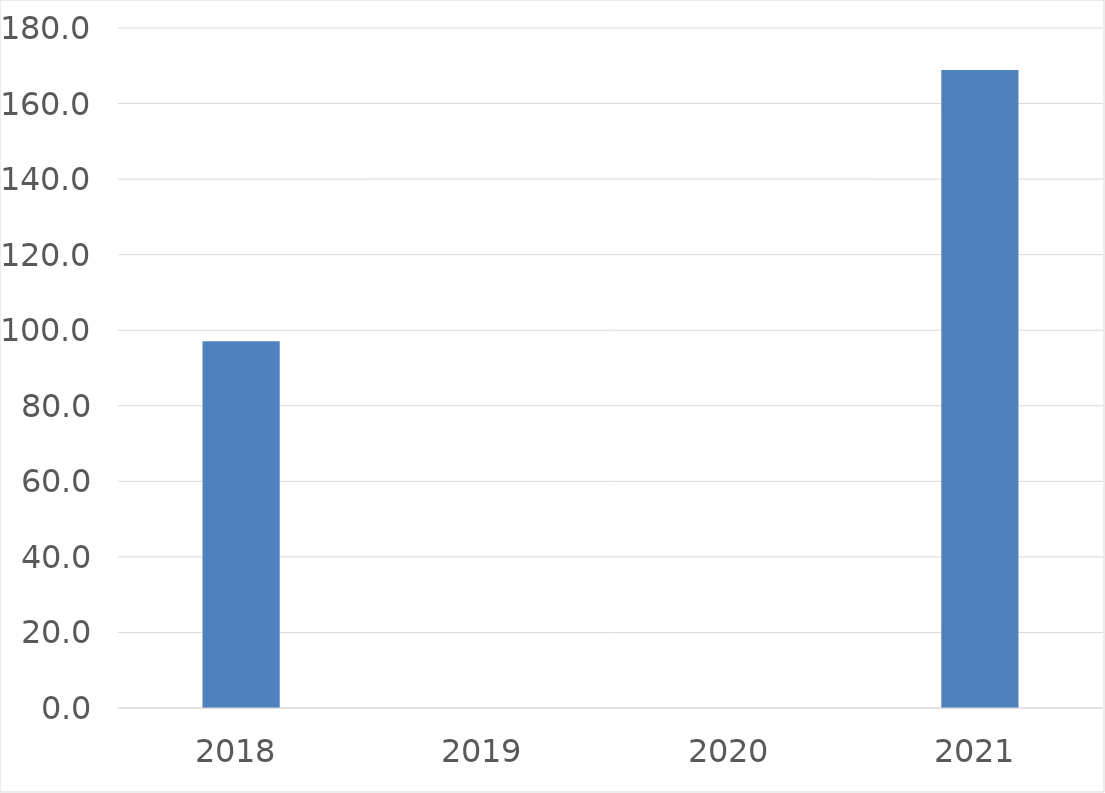
| Category | Series 0 |
|---|---|
| 2018 | 97.1 |
| 2019 | 0 |
| 2020 | 0 |
| 2021 | 168.9 |